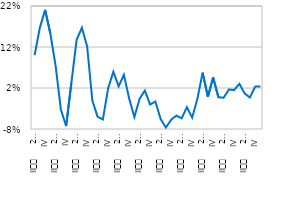
| Category | Period | Annual growth of real estate prices (%) |
|---|---|---|
| II
     2008 |  | 0.1 |
| III |  | 0.167 |
| IV |  | 0.211 |
| I
2009 |  | 0.152 |
| II
     2009 |  | 0.074 |
| III |  | -0.032 |
| IV
 |  | -0.073 |
| I
2010 |  | 0.033 |
| II
     2010 |  | 0.137 |
| III |  | 0.167 |
| IV |  | 0.122 |
| I
2011 |  | -0.012 |
| II
     2011 |  | -0.05 |
| III |  | -0.057 |
| IV |  | 0.019 |
| I
2012 |  | 0.06 |
| II
     2012 |  | 0.024 |
| III |  | 0.052 |
| IV |  | -0.005 |
| I
2013 |  | -0.051 |
| II
     2013 |  | -0.006 |
| III |  | 0.014 |
| IV |  | -0.02 |
| I
2014 |  | -0.013 |
| II
     2014 |  | -0.056 |
| III |  | -0.076 |
| IV |  | -0.057 |
| I
2015 |  | -0.047 |
| II
     2015 |  | -0.054 |
| III |  | -0.027 |
| IV |  | -0.052 |
| I
2016 |  | -0.007 |
| II
     2016 |  | 0.057 |
| III |  | -0.002 |
| IV |  | 0.046 |
| I
2017 |  | -0.002 |
| II
     2017 |  | -0.004 |
| III |  | 0.016 |
| IV |  | 0.015 |
| I
2018 |  | 0.03 |
| II
     2018 |  | 0.007 |
| III |  | -0.003 |
| IV |  | 0.023 |